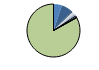
| Category | Series 0 |
|---|---|
| ARRASTRE | 17 |
| CERCO | 22 |
| ATUNEROS CAÑEROS | 3 |
| PALANGRE DE FONDO | 5 |
| PALANGRE DE SUPERFICIE | 5 |
| RASCO | 0 |
| VOLANTA | 3 |
| ARTES FIJAS | 1 |
| ARTES MENORES | 274 |